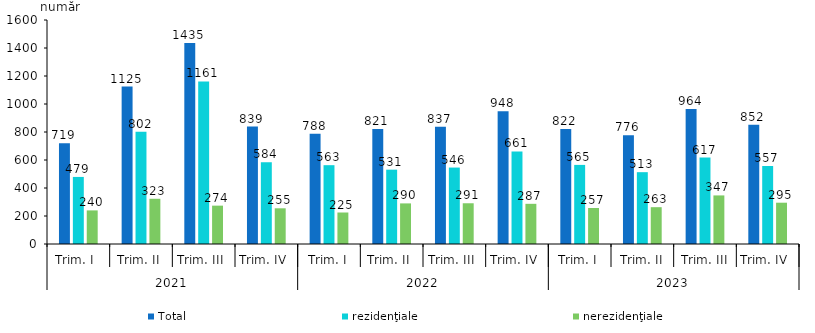
| Category | Total | rezidenţiale | nerezidenţiale |
|---|---|---|---|
| 0 | 719 | 479 | 240 |
| 1 | 1125 | 802 | 323 |
| 2 | 1435 | 1161 | 274 |
| 3 | 839 | 584 | 255 |
| 4 | 788 | 563 | 225 |
| 5 | 821 | 531 | 290 |
| 6 | 837 | 546 | 291 |
| 7 | 948 | 661 | 287 |
| 8 | 822 | 565 | 257 |
| 9 | 776 | 513 | 263 |
| 10 | 964 | 617 | 347 |
| 11 | 852 | 557 | 295 |